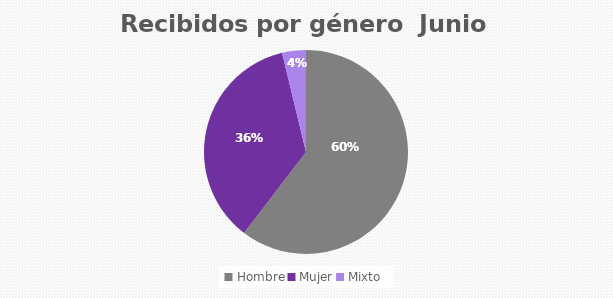
| Category | Recibidos por género  JUNIO |
|---|---|
| Hombre | 32 |
| Mujer | 19 |
| Mixto | 2 |